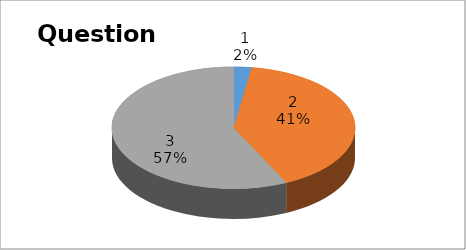
| Category | Series 0 |
|---|---|
| 0 | 5 |
| 1 | 85 |
| 2 | 120 |